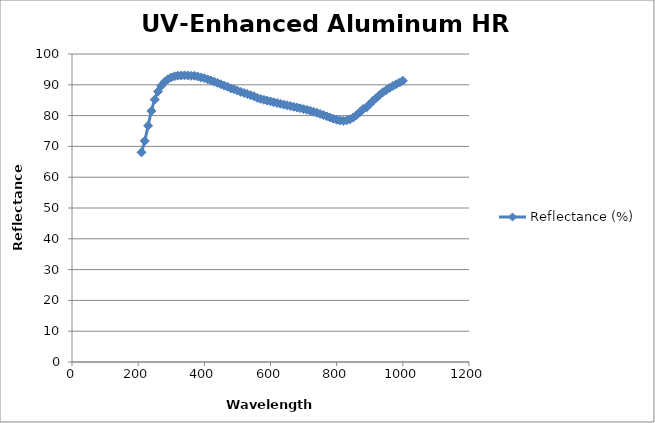
| Category | Reflectance (%) |
|---|---|
| 1000.0 | 91.31 |
| 990.0 | 90.745 |
| 980.0 | 90.184 |
| 970.0 | 89.621 |
| 960.0 | 88.998 |
| 950.0 | 88.32 |
| 940.0 | 87.596 |
| 930.0 | 86.727 |
| 920.0 | 85.797 |
| 910.0 | 84.802 |
| 900.0 | 83.739 |
| 890.0 | 82.642 |
| 880.0 | 82.142 |
| 870.0 | 81.094 |
| 860.0 | 80.152 |
| 850.0 | 79.367 |
| 840.0 | 78.793 |
| 830.0 | 78.44 |
| 820.0 | 78.294 |
| 810.0 | 78.408 |
| 800.0 | 78.653 |
| 790.0 | 78.98 |
| 780.0 | 79.379 |
| 770.0 | 79.765 |
| 760.0 | 80.183 |
| 750.0 | 80.559 |
| 740.0 | 80.919 |
| 730.0 | 81.26 |
| 720.0 | 81.553 |
| 710.0 | 81.867 |
| 700.0 | 82.112 |
| 690.0 | 82.38 |
| 680.0 | 82.637 |
| 670.0 | 82.871 |
| 660.0 | 83.097 |
| 650.0 | 83.345 |
| 640.0 | 83.594 |
| 630.0 | 83.829 |
| 620.0 | 84.075 |
| 610.0 | 84.345 |
| 600.0 | 84.602 |
| 590.0 | 84.883 |
| 580.0 | 85.137 |
| 570.0 | 85.437 |
| 560.0 | 85.754 |
| 550.0 | 86.289 |
| 540.0 | 86.628 |
| 530.0 | 86.988 |
| 520.0 | 87.343 |
| 510.0 | 87.689 |
| 500.0 | 88.114 |
| 490.0 | 88.541 |
| 480.0 | 88.821 |
| 470.0 | 89.374 |
| 460.0 | 89.746 |
| 450.0 | 90.176 |
| 440.0 | 90.617 |
| 430.0 | 91.013 |
| 420.0 | 91.414 |
| 410.0 | 91.771 |
| 400.0 | 92.143 |
| 390.0 | 92.415 |
| 380.0 | 92.698 |
| 370.0 | 92.939 |
| 360.0 | 92.92 |
| 350.0 | 93.028 |
| 340.0 | 93.076 |
| 330.0 | 93.034 |
| 320.0 | 92.974 |
| 310.0 | 92.764 |
| 300.0 | 92.373 |
| 290.0 | 91.807 |
| 280.0 | 90.97 |
| 270.0 | 89.688 |
| 260.0 | 87.838 |
| 250.0 | 85.204 |
| 240.0 | 81.485 |
| 230.0 | 76.7 |
| 220.0 | 71.783 |
| 210.0 | 68.08 |